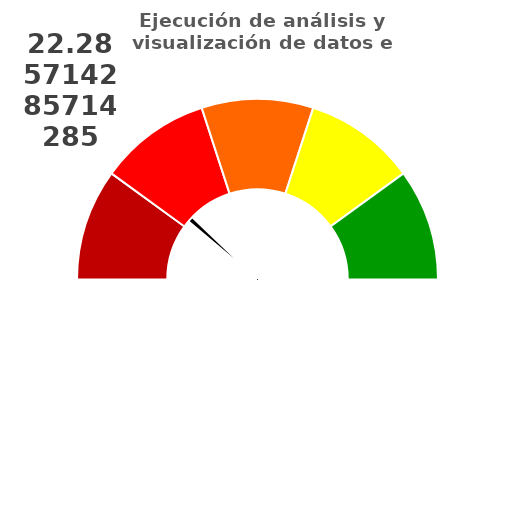
| Category | refe |
|---|---|
| 0 | 22.286 |
| 1 | 2 |
| 2 | 175.714 |